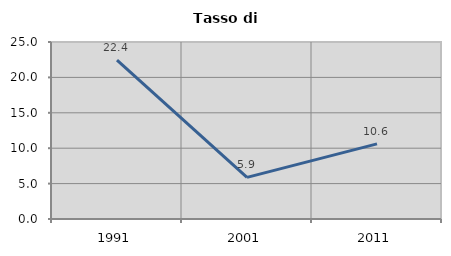
| Category | Tasso di disoccupazione   |
|---|---|
| 1991.0 | 22.43 |
| 2001.0 | 5.882 |
| 2011.0 | 10.612 |